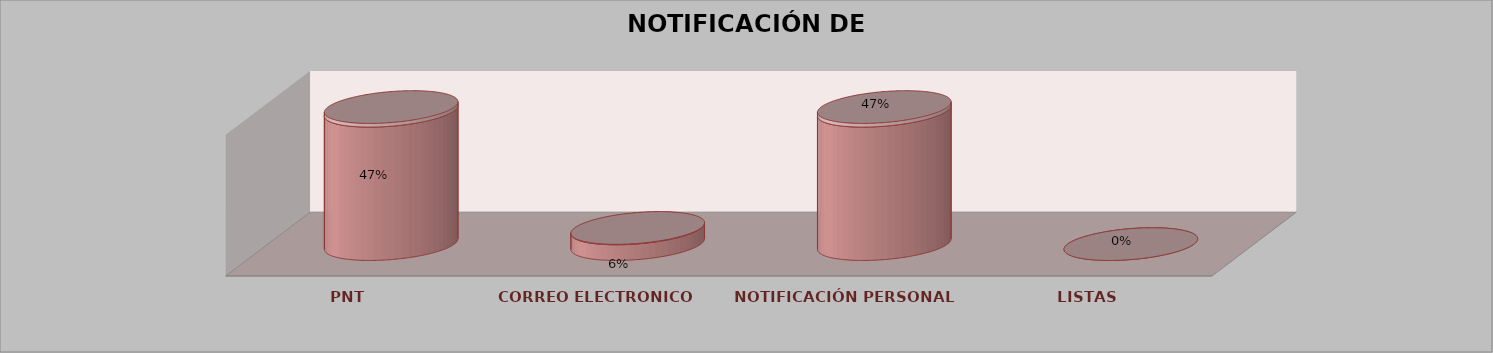
| Category | Series 0 | Series 1 | Series 2 | Series 3 | Series 4 |
|---|---|---|---|---|---|
| PNT |  |  |  | 17 | 0.472 |
| CORREO ELECTRONICO |  |  |  | 2 | 0.056 |
| NOTIFICACIÓN PERSONAL |  |  |  | 17 | 0.472 |
| LISTAS |  |  |  | 0 | 0 |